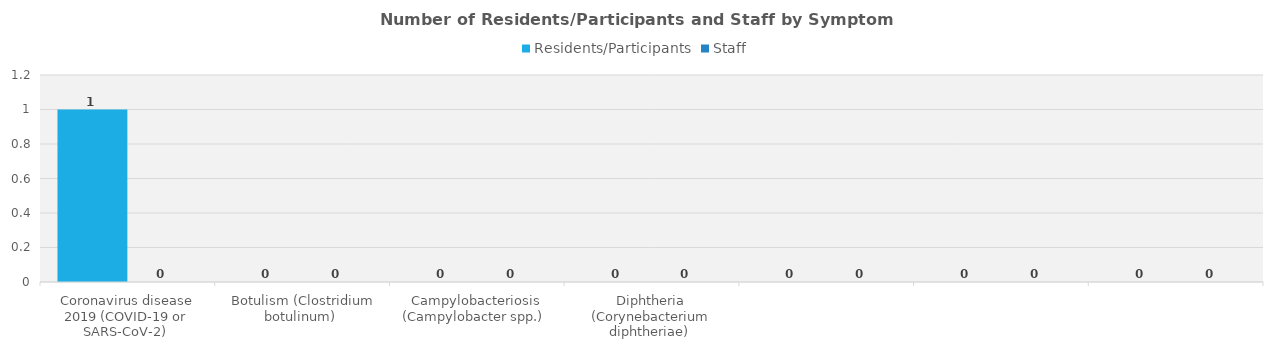
| Category | Residents/Participants | Staff |
|---|---|---|
| Coronavirus disease 2019 (COVID-19 or SARS-CoV-2)  | 1 | 0 |
| Botulism (Clostridium botulinum)  | 0 | 0 |
| Campylobacteriosis (Campylobacter spp.)  | 0 | 0 |
| Diphtheria (Corynebacterium diphtheriae)  | 0 | 0 |